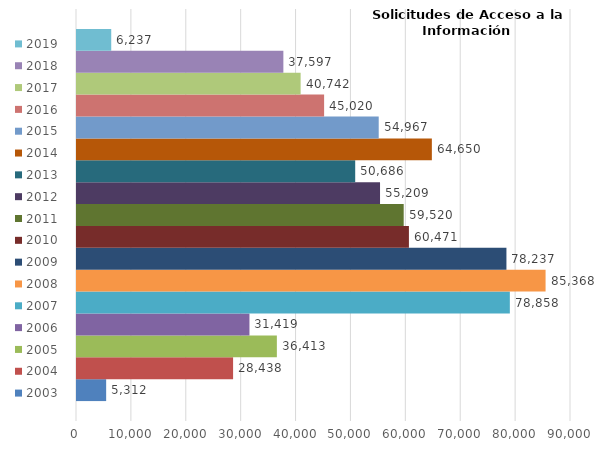
| Category | 2003 | 2004 | 2005 | 2006 | 2007 | 2008 | 2009 | 2010 | 2011 | 2012 | 2013 | 2014 | 2015 | 2016 | 2017 | 2018 | 2019 |
|---|---|---|---|---|---|---|---|---|---|---|---|---|---|---|---|---|---|
| 0 | 5312 | 28438 | 36413 | 31419 | 78858 | 85368 | 78237 | 60471 | 59520 | 55209 | 50686 | 64650 | 54967 | 45020 | 40742 | 37597 | 6237 |